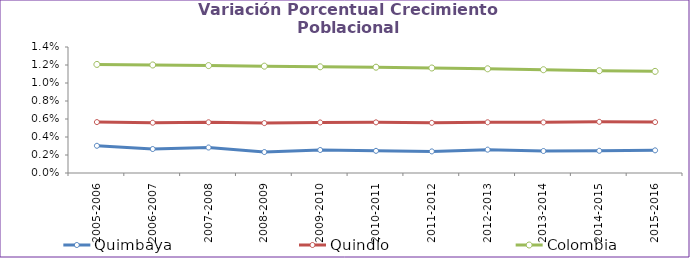
| Category | Quimbaya | Quindío | Colombia |
|---|---|---|---|
| 2005-2006 | 0.003 | 0.006 | 0.012 |
| 2006-2007 | 0.003 | 0.006 | 0.012 |
| 2007-2008 | 0.003 | 0.006 | 0.012 |
| 2008-2009 | 0.002 | 0.006 | 0.012 |
| 2009-2010 | 0.003 | 0.006 | 0.012 |
| 2010-2011 | 0.002 | 0.006 | 0.012 |
| 2011-2012 | 0.002 | 0.006 | 0.012 |
| 2012-2013 | 0.003 | 0.006 | 0.012 |
| 2013-2014 | 0.002 | 0.006 | 0.011 |
| 2014-2015 | 0.002 | 0.006 | 0.011 |
| 2015-2016 | 0.003 | 0.006 | 0.011 |